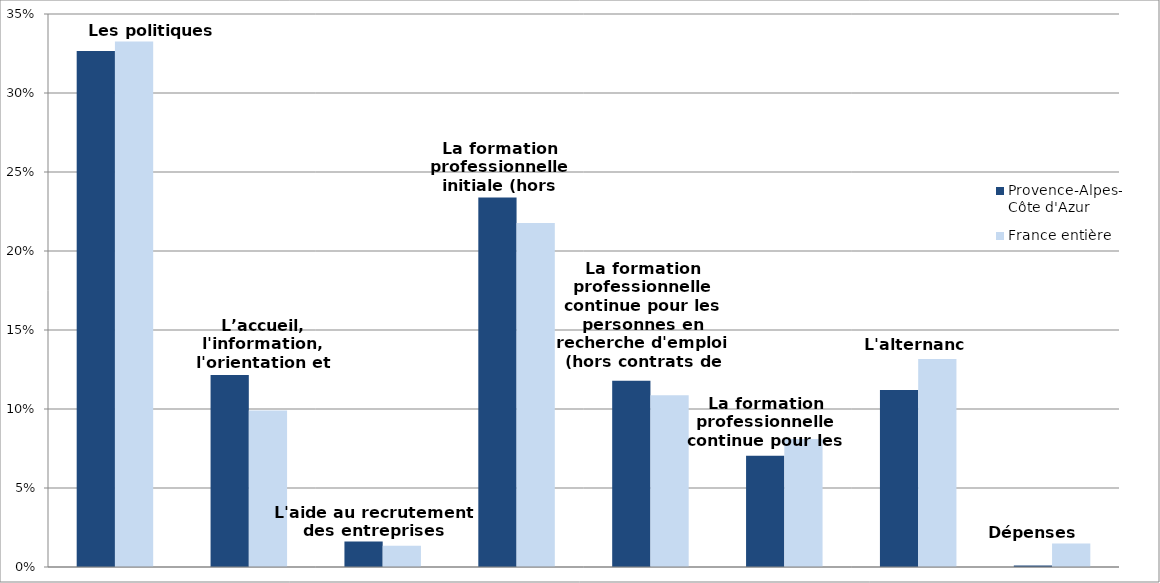
| Category | Provence-Alpes-Côte d'Azur | France entière |
|---|---|---|
| Les politiques d'emploi | 0.327 | 0.333 |
| L’accueil, l'information, l'orientation et l'accompagnement | 0.122 | 0.099 |
| L'aide au recrutement des entreprises | 0.016 | 0.013 |
| La formation professionnelle initiale (hors apprentissage) | 0.234 | 0.218 |
| La formation professionnelle continue pour les personnes en recherche d'emploi (hors contrats de professionnalisation) | 0.118 | 0.109 |
| La formation professionnelle continue pour les actifs occupés | 0.07 | 0.081 |
| L'alternance | 0.112 | 0.132 |
| Dépenses non-ventilables | 0.001 | 0.015 |